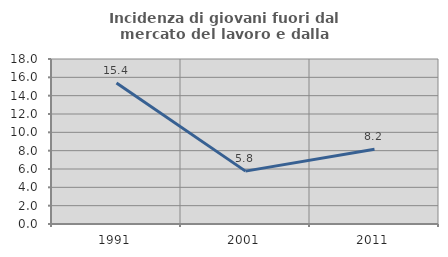
| Category | Incidenza di giovani fuori dal mercato del lavoro e dalla formazione  |
|---|---|
| 1991.0 | 15.385 |
| 2001.0 | 5.769 |
| 2011.0 | 8.163 |